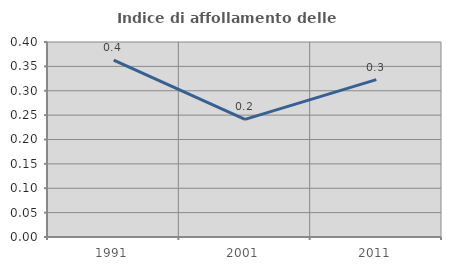
| Category | Indice di affollamento delle abitazioni  |
|---|---|
| 1991.0 | 0.363 |
| 2001.0 | 0.241 |
| 2011.0 | 0.323 |